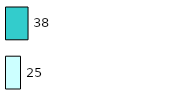
| Category | Series 0 | Series 1 |
|---|---|---|
| 0 | 25 | 38 |